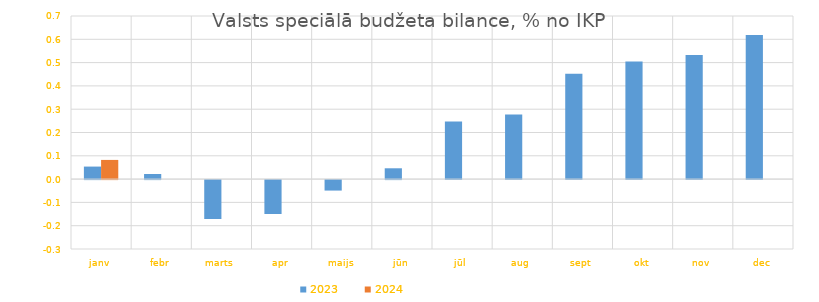
| Category | 2023 | 2024 |
|---|---|---|
| janv | 0.054 | 0.082 |
| febr | 0.022 | 0 |
| marts | -0.167 | 0 |
| apr | -0.145 | 0 |
| maijs | -0.045 | 0 |
| jūn | 0.046 | 0 |
| jūl | 0.247 | 0 |
| aug | 0.278 | 0 |
| sept | 0.453 | 0 |
| okt | 0.505 | 0 |
| nov | 0.532 | 0 |
| dec | 0.618 | 0 |